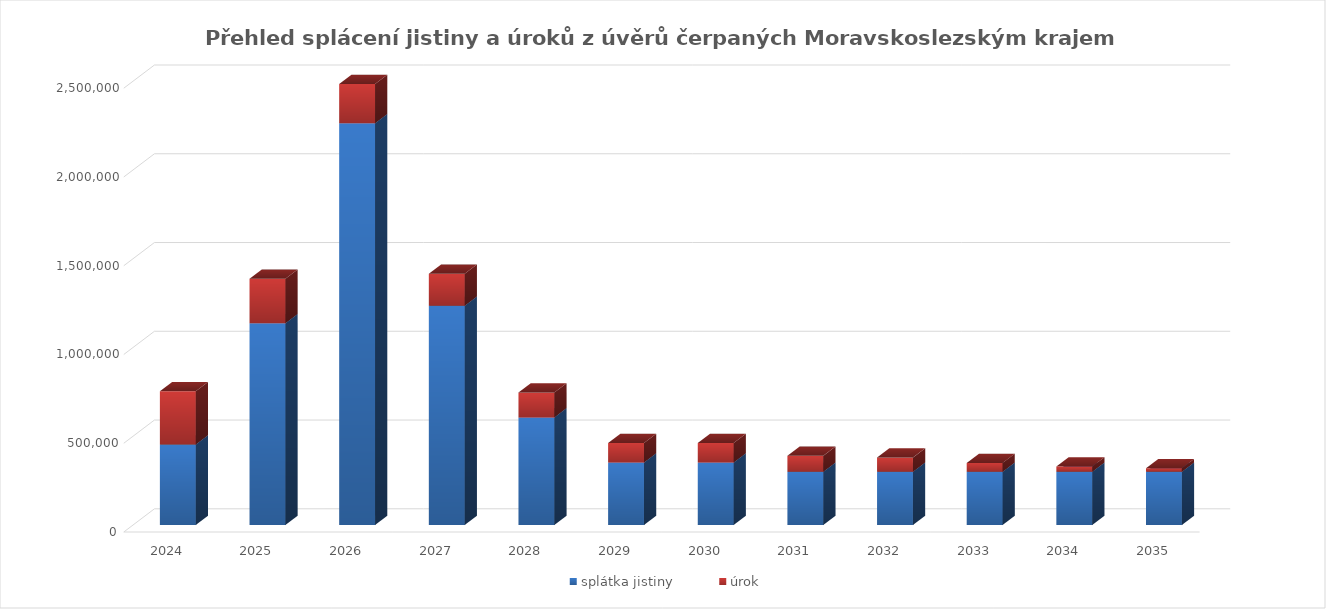
| Category | splátka jistiny | úrok |
|---|---|---|
| 2024.0 | 453475 | 300000 |
| 2025.0 | 1136721 | 250000 |
| 2026.0 | 2263830 | 220000 |
| 2027.0 | 1235358 | 180000 |
| 2028.0 | 606350 | 140000 |
| 2029.0 | 352450 | 110000 |
| 2030.0 | 352450 | 110000 |
| 2031.0 | 300000 | 90000 |
| 2032.0 | 300000 | 80000 |
| 2033.0 | 300000 | 50000 |
| 2034.0 | 300000 | 30000 |
| 2035.0 | 300000 | 20000 |